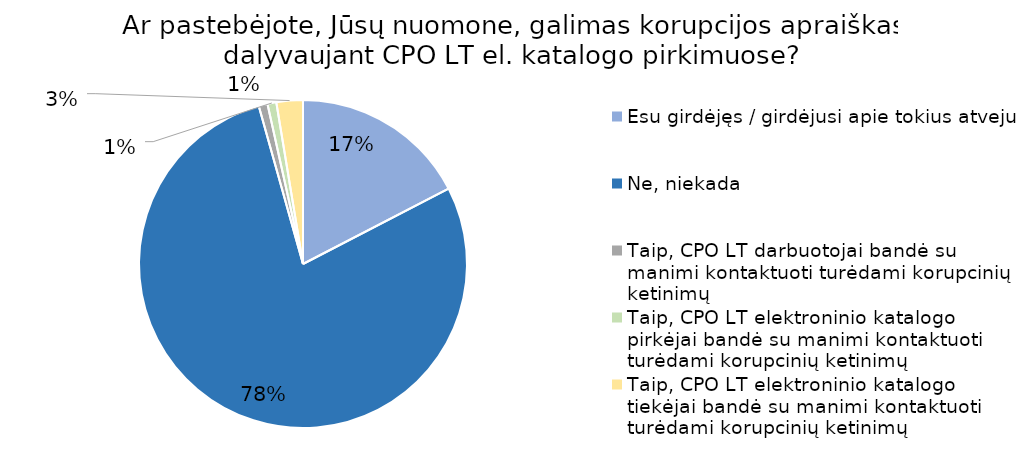
| Category | Series 0 |
|---|---|
| Esu girdėjęs / girdėjusi apie tokius atvejus | 20 |
| Ne, niekada | 90 |
| Taip, CPO LT darbuotojai bandė su manimi kontaktuoti turėdami korupcinių ketinimų | 1 |
| Taip, CPO LT elektroninio katalogo pirkėjai bandė su manimi kontaktuoti turėdami korupcinių ketinimų | 1 |
| Taip, CPO LT elektroninio katalogo tiekėjai bandė su manimi kontaktuoti turėdami korupcinių ketinimų | 3 |